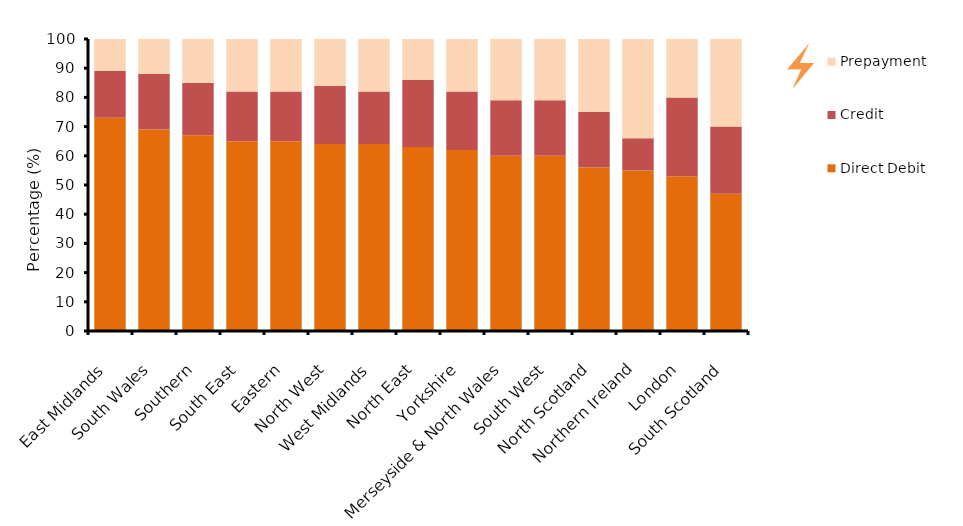
| Category | Direct Debit | Credit | Prepayment |
|---|---|---|---|
| East Midlands | 73 | 16 | 11 |
| South Wales | 69 | 19 | 12 |
| Southern | 67 | 18 | 15 |
| South East | 65 | 17 | 18 |
| Eastern | 65 | 17 | 19 |
| North West | 64 | 20 | 16 |
| West Midlands | 64 | 18 | 19 |
| North East | 63 | 23 | 14 |
| Yorkshire | 62 | 20 | 19 |
| Merseyside & North Wales | 60 | 19 | 21 |
| South West | 60 | 19 | 21 |
| North Scotland | 56 | 19 | 26 |
| Northern Ireland | 55 | 11 | 34 |
| London | 53 | 27 | 20 |
| South Scotland | 47 | 23 | 30 |